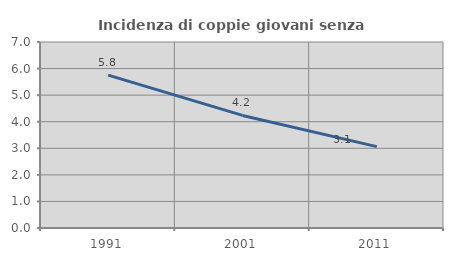
| Category | Incidenza di coppie giovani senza figli |
|---|---|
| 1991.0 | 5.756 |
| 2001.0 | 4.237 |
| 2011.0 | 3.064 |